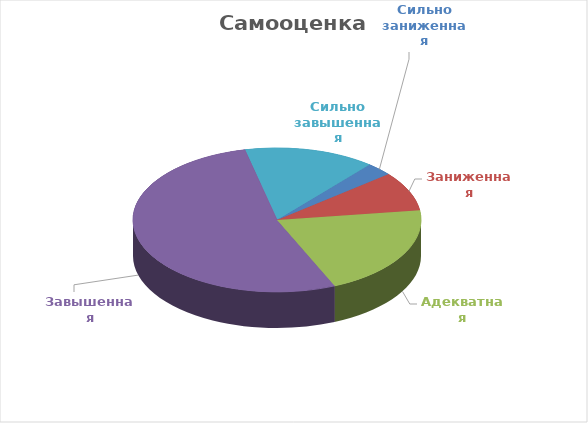
| Category | Series 0 |
|---|---|
| Сильно заниженная | 0.029 |
| Заниженная | 0.088 |
| Адекватная | 0.206 |
| Завышенная | 0.529 |
| Сильно завышенная | 0.147 |